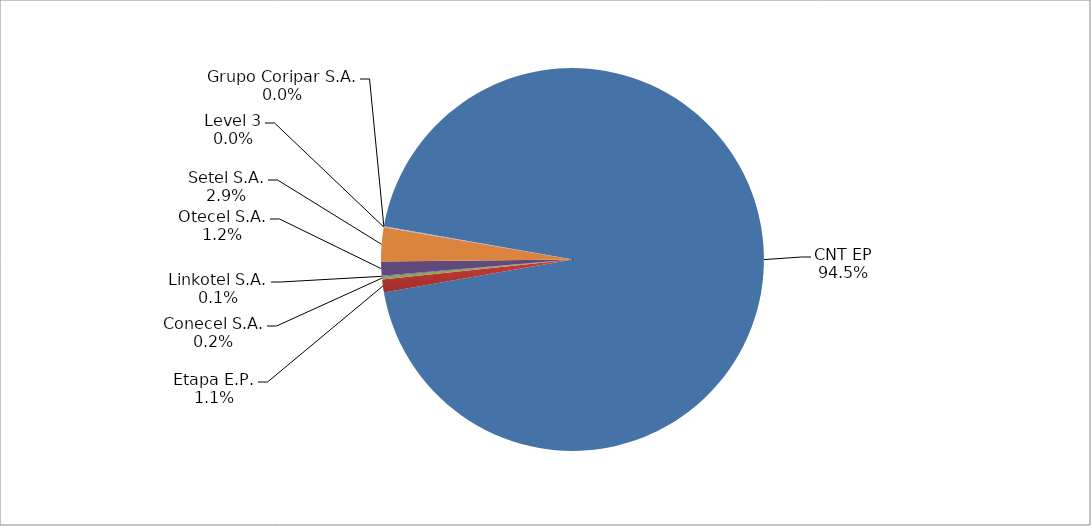
| Category | Series 0 |
|---|---|
| CNT EP | 2149 |
| Etapa E.P. | 25 |
| Conecel S.A. | 5 |
| Linkotel S.A. | 2 |
| Otecel S.A. | 27 |
| Setel S.A. | 65 |
| Level 3 | 1 |
| Grupo Coripar S.A. | 1 |